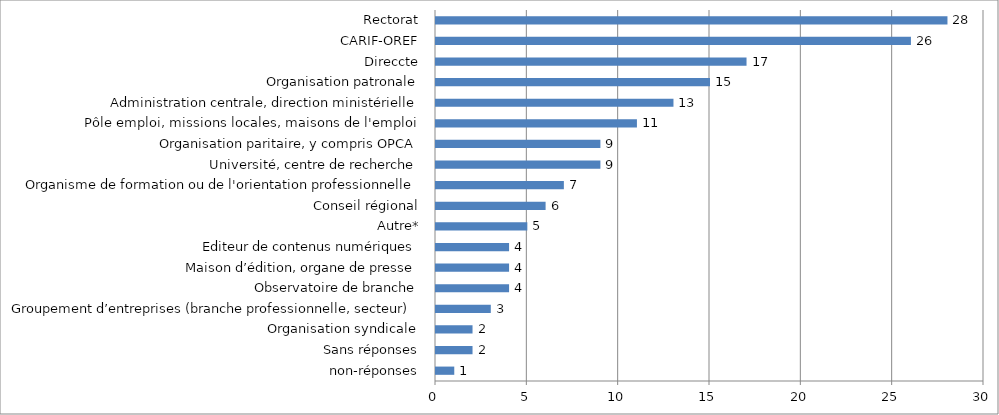
| Category | Series 0 |
|---|---|
| non-réponses | 1 |
| Sans réponses | 2 |
| Organisation syndicale | 2 |
| Groupement d’entreprises (branche professionnelle, secteur) | 3 |
| Observatoire de branche | 4 |
| Maison d’édition, organe de presse | 4 |
| Editeur de contenus numériques | 4 |
| Autre* | 5 |
| Conseil régional | 6 |
| Organisme de formation ou de l'orientation professionnelle | 7 |
| Université, centre de recherche | 9 |
| Organisation paritaire, y compris OPCA | 9 |
| Pôle emploi, missions locales, maisons de l'emploi | 11 |
| Administration centrale, direction ministérielle | 13 |
| Organisation patronale | 15 |
| Direccte | 17 |
| CARIF-OREF | 26 |
| Rectorat | 28 |